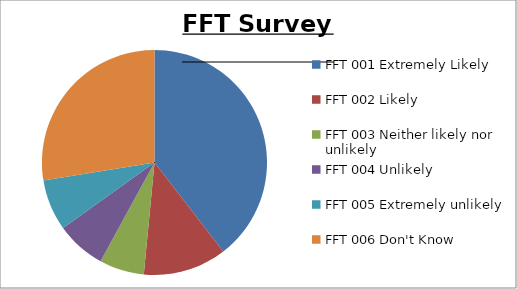
| Category | Total  |
|---|---|
| 0 | 221 |
| 1 | 67 |
| 2 | 36 |
| 3 | 40 |
| 4 | 41 |
| 5 | 154 |